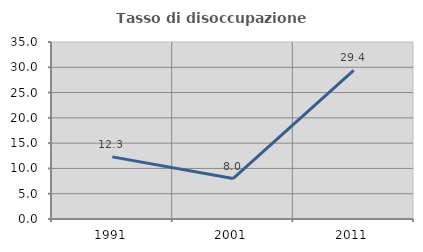
| Category | Tasso di disoccupazione giovanile  |
|---|---|
| 1991.0 | 12.281 |
| 2001.0 | 8 |
| 2011.0 | 29.412 |